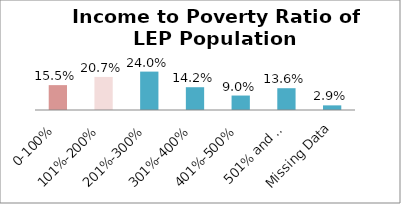
| Category | Percent |
|---|---|
| 0-100% | 0.155 |
| 101%-200% | 0.207 |
| 201%-300% | 0.24 |
| 301%-400% | 0.142 |
| 401%-500% | 0.09 |
| 501% and Over | 0.136 |
| Missing Data | 0.029 |